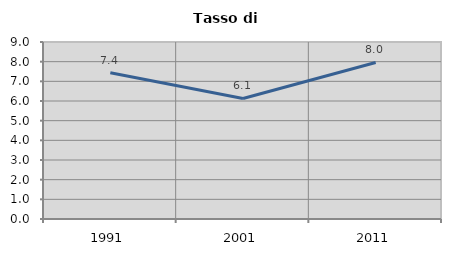
| Category | Tasso di disoccupazione   |
|---|---|
| 1991.0 | 7.435 |
| 2001.0 | 6.129 |
| 2011.0 | 7.961 |